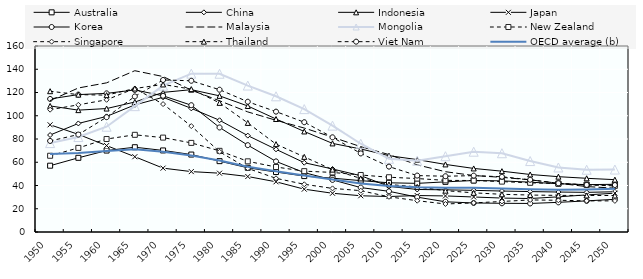
| Category | Australia | China | Indonesia | Japan | Korea | Malaysia | Mongolia | New Zealand | Singapore | Thailand | Viet Nam | OECD average (b) |
|---|---|---|---|---|---|---|---|---|---|---|---|---|
| 1950.0 | 57.034 | 83.415 | 108.429 | 92.209 | 114.466 | 113.061 | 76.49 | 65.586 | 105.225 | 121.107 | 78.339 | 67.093 |
| 1955.0 | 63.816 | 93.385 | 104.83 | 83.986 | 118.198 | 123.891 | 81.695 | 72.339 | 109.396 | 118.167 | 83.81 | 67.879 |
| 1960.0 | 70.067 | 99.426 | 106.191 | 74.341 | 119.24 | 128.311 | 90.56 | 79.985 | 113.723 | 117.727 | 98.774 | 69.701 |
| 1965.0 | 72.933 | 109.338 | 111.808 | 64.746 | 122.213 | 138.75 | 108.256 | 83.596 | 123.467 | 123.437 | 116.626 | 71.159 |
| 1970.0 | 70.156 | 115.861 | 120.085 | 54.924 | 117.147 | 133.737 | 125.847 | 81.202 | 110.034 | 126.917 | 130.778 | 69.001 |
| 1975.0 | 66.613 | 106.35 | 122.442 | 51.956 | 109.071 | 122.022 | 136.232 | 76.645 | 91.098 | 122.904 | 130.084 | 65.769 |
| 1980.0 | 60.954 | 96.109 | 117.107 | 50.58 | 89.932 | 112.89 | 136.126 | 69.819 | 69.045 | 111.076 | 122.397 | 61.545 |
| 1985.0 | 55.235 | 82.906 | 108.398 | 47.719 | 74.701 | 103.3 | 125.97 | 60.792 | 54.727 | 93.832 | 112.064 | 56.119 |
| 1990.0 | 51.593 | 71.128 | 97.211 | 43.18 | 60.735 | 96.094 | 116.733 | 55.91 | 46.18 | 75.588 | 103.533 | 52.275 |
| 1995.0 | 48.105 | 59.611 | 86.483 | 36.852 | 51.089 | 89.417 | 105.7 | 52.354 | 41.044 | 64.622 | 94.44 | 48.641 |
| 2000.0 | 46.313 | 54.198 | 76.209 | 33.332 | 44.809 | 81.567 | 91.501 | 51.245 | 37.517 | 53.657 | 81.454 | 45.075 |
| 2005.0 | 44.191 | 48.441 | 71.417 | 31.181 | 38.224 | 73.394 | 75.911 | 49.034 | 35.576 | 46.083 | 67.599 | 41.813 |
| 2010.0 | 42.329 | 39.229 | 65.647 | 30.511 | 35.013 | 66.592 | 62.928 | 47.116 | 30.262 | 40.887 | 56.254 | 39.665 |
| 2015.0 | 41.835 | 36.585 | 62.261 | 31.36 | 29.973 | 57.736 | 61.298 | 45.976 | 26.922 | 38.795 | 48.531 | 38.484 |
| 2020.0 | 43.142 | 36.274 | 58.136 | 31.032 | 25.994 | 51.86 | 65.188 | 44.41 | 24.112 | 35.544 | 47.979 | 38.105 |
| 2025.0 | 44.289 | 35.836 | 54.67 | 30.108 | 24.962 | 48.576 | 69.059 | 44.278 | 25.026 | 33.694 | 48.486 | 38.118 |
| 2030.0 | 43.979 | 35.233 | 52.32 | 29.194 | 24.7 | 47.007 | 67.747 | 43.338 | 26.258 | 32.435 | 47.521 | 37.514 |
| 2035.0 | 42.863 | 34.774 | 49.48 | 28.779 | 24.548 | 44.875 | 61.029 | 42.315 | 27.577 | 31.791 | 44.94 | 36.745 |
| 2040.0 | 41.522 | 34.37 | 47.594 | 30.256 | 25.517 | 41.897 | 55.509 | 41.66 | 27.294 | 31.478 | 41.942 | 36.378 |
| 2045.0 | 40.743 | 34.108 | 46.184 | 31.903 | 26.767 | 39.079 | 53.538 | 40.516 | 26.802 | 31.441 | 40.505 | 36.543 |
| 2050.0 | 41.034 | 34.624 | 45.025 | 33.388 | 28.127 | 37.707 | 53.721 | 39.675 | 26.754 | 31.372 | 40.4 | 37.132 |